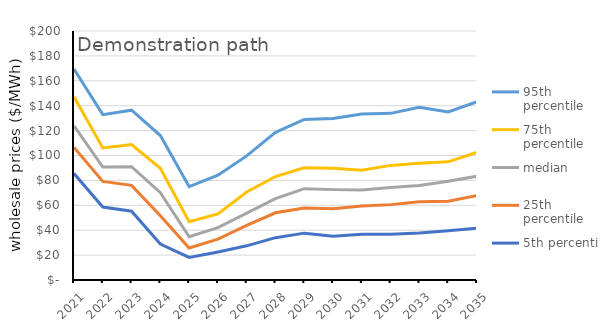
| Category | 95th percentile | 75th percentile | median | 25th percentile | 5th percentile |
|---|---|---|---|---|---|
| 2021.0 | 169.486 | 147.14 | 123.84 | 106.44 | 85.55 |
| 2022.0 | 132.822 | 106.1 | 90.75 | 79.22 | 58.646 |
| 2023.0 | 136.382 | 108.83 | 90.96 | 76.01 | 55.23 |
| 2024.0 | 116.034 | 89.74 | 70.15 | 51.61 | 28.852 |
| 2025.0 | 74.924 | 46.86 | 34.77 | 25.68 | 18.188 |
| 2026.0 | 84.222 | 53.08 | 42.08 | 32.81 | 22.454 |
| 2027.0 | 99.682 | 70.71 | 53.65 | 43.88 | 27.442 |
| 2028.0 | 118.576 | 83.1 | 65.36 | 54 | 33.994 |
| 2029.0 | 128.998 | 90.19 | 73.38 | 57.89 | 37.638 |
| 2030.0 | 129.704 | 89.83 | 72.59 | 57.17 | 35.096 |
| 2031.0 | 133.356 | 88.08 | 72.27 | 59.5 | 36.748 |
| 2032.0 | 133.838 | 92.06 | 74.3 | 60.54 | 36.73 |
| 2033.0 | 138.824 | 93.68 | 75.99 | 62.78 | 37.722 |
| 2034.0 | 134.91 | 94.93 | 79.26 | 63.3 | 39.524 |
| 2035.0 | 143.192 | 102.58 | 83.36 | 67.81 | 41.732 |